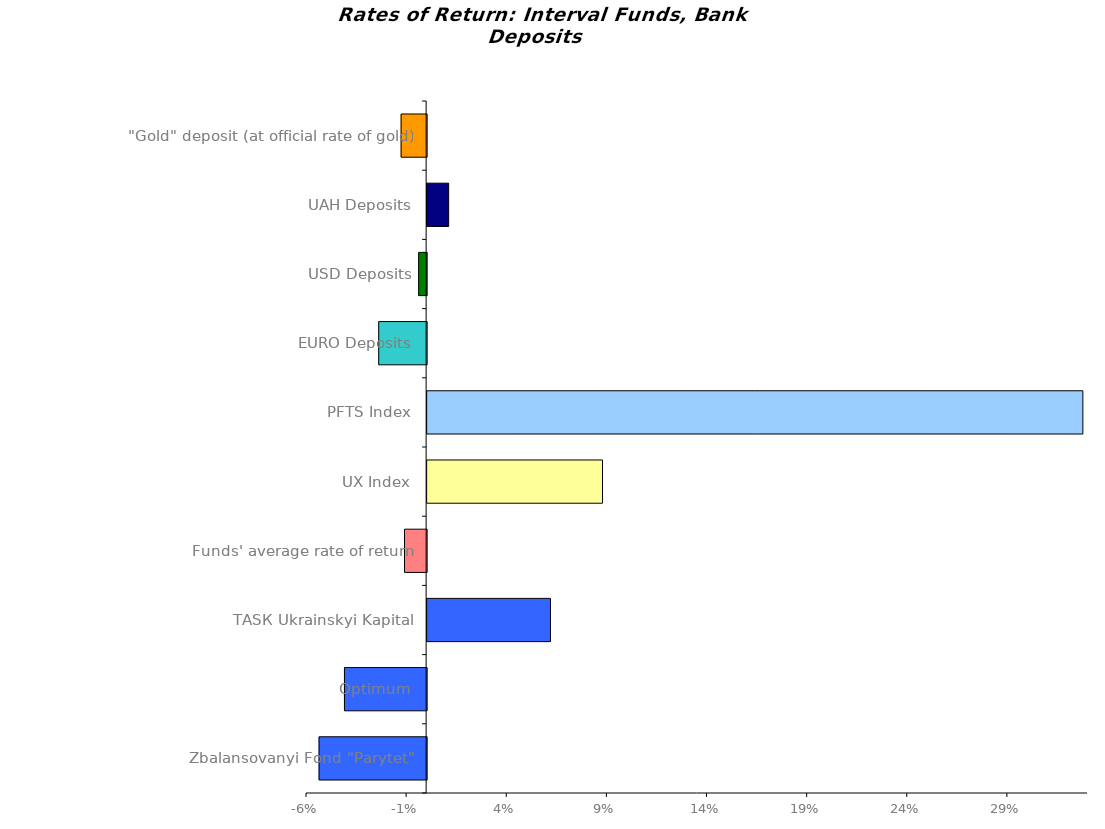
| Category | Series 0 |
|---|---|
| Zbalansovanyi Fond "Parytet" | -0.054 |
| Optimum | -0.041 |
| ТАSК Ukrainskyi Kapital | 0.062 |
| Funds' average rate of return | -0.011 |
| UX Index | 0.088 |
| PFTS Index | 0.327 |
| EURO Deposits | -0.024 |
| USD Deposits | -0.004 |
| UAH Deposits | 0.011 |
| "Gold" deposit (at official rate of gold) | -0.013 |